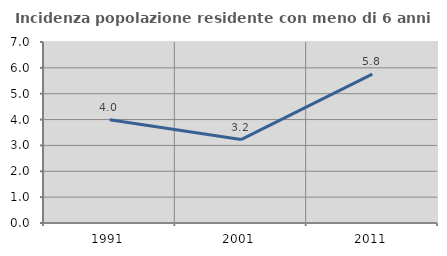
| Category | Incidenza popolazione residente con meno di 6 anni |
|---|---|
| 1991.0 | 3.991 |
| 2001.0 | 3.226 |
| 2011.0 | 5.758 |